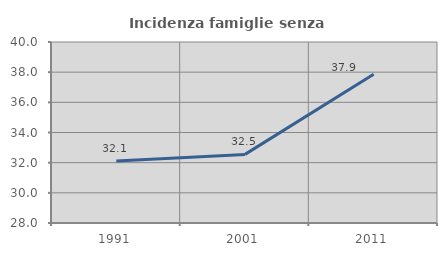
| Category | Incidenza famiglie senza nuclei |
|---|---|
| 1991.0 | 32.114 |
| 2001.0 | 32.549 |
| 2011.0 | 37.857 |